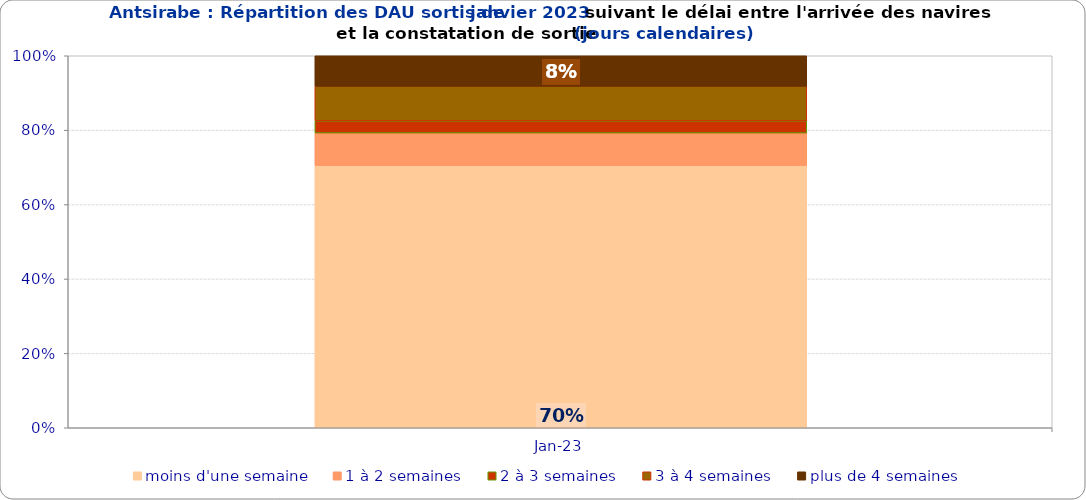
| Category | moins d'une semaine | 1 à 2 semaines | 2 à 3 semaines | 3 à 4 semaines | plus de 4 semaines |
|---|---|---|---|---|---|
| 2023-01-01 | 0.705 | 0.087 | 0.033 | 0.093 | 0.082 |